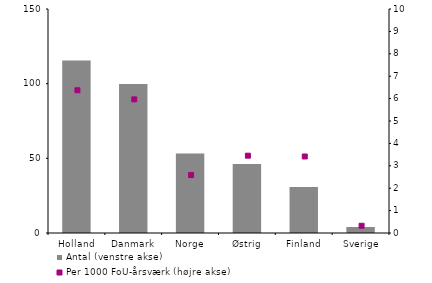
| Category | Antal (venstre akse) |
|---|---|
| Holland | 115.5 |
| Danmark | 99.75 |
| Norge | 53.25 |
| Østrig | 46.25 |
| Finland | 30.75 |
| Sverige | 4 |